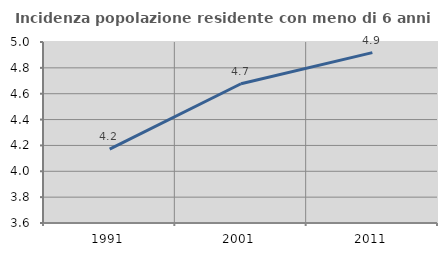
| Category | Incidenza popolazione residente con meno di 6 anni |
|---|---|
| 1991.0 | 4.172 |
| 2001.0 | 4.677 |
| 2011.0 | 4.918 |